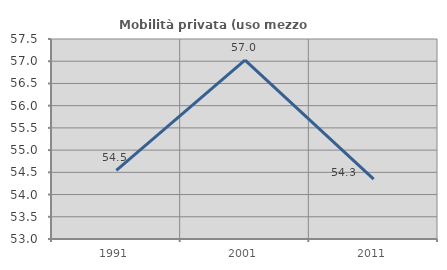
| Category | Mobilità privata (uso mezzo privato) |
|---|---|
| 1991.0 | 54.545 |
| 2001.0 | 57.025 |
| 2011.0 | 54.348 |